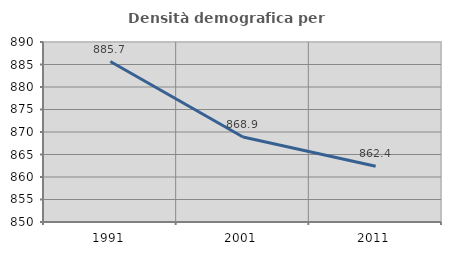
| Category | Densità demografica |
|---|---|
| 1991.0 | 885.666 |
| 2001.0 | 868.881 |
| 2011.0 | 862.391 |